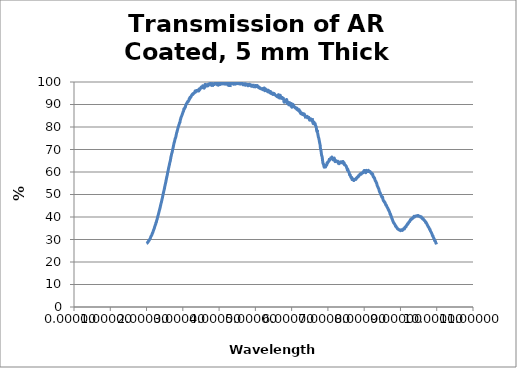
| Category | Series 0 |
|---|---|
| 2.00007 | 28.184 |
| 2.00994 | 28.275 |
| 2.0201 | 28.562 |
| 2.02997 | 28.654 |
| 2.03984 | 28.827 |
| 2.04998 | 29.098 |
| 2.05984 | 29.573 |
| 2.06999 | 29.534 |
| 2.07984 | 29.882 |
| 2.08997 | 30.163 |
| 2.09982 | 30.417 |
| 2.10995 | 30.806 |
| 2.11979 | 31.333 |
| 2.12991 | 31.591 |
| 2.14003 | 31.817 |
| 2.14986 | 32.211 |
| 2.15997 | 32.78 |
| 2.1698 | 32.995 |
| 2.1799 | 33.454 |
| 2.19 | 33.959 |
| 2.19982 | 34.438 |
| 2.20991 | 34.766 |
| 2.21972 | 35.372 |
| 2.22981 | 35.92 |
| 2.23989 | 36.397 |
| 2.24969 | 36.735 |
| 2.25977 | 37.517 |
| 2.26984 | 37.629 |
| 2.27991 | 38.534 |
| 2.2897 | 38.806 |
| 2.29976 | 39.561 |
| 2.30982 | 40.24 |
| 2.31987 | 40.815 |
| 2.32964 | 41.359 |
| 2.33969 | 42.04 |
| 2.34973 | 42.718 |
| 2.35977 | 43.308 |
| 2.36981 | 43.908 |
| 2.37984 | 44.627 |
| 2.38959 | 45.307 |
| 2.39962 | 46.044 |
| 2.40964 | 46.557 |
| 2.41965 | 47.316 |
| 2.42967 | 48.089 |
| 2.43968 | 48.739 |
| 2.44968 | 49.583 |
| 2.45968 | 50.369 |
| 2.46968 | 51.041 |
| 2.47968 | 51.724 |
| 2.48967 | 52.383 |
| 2.49965 | 53.287 |
| 2.50964 | 54.021 |
| 2.51961 | 54.75 |
| 2.52959 | 55.474 |
| 2.53956 | 56.311 |
| 2.54953 | 57.096 |
| 2.55949 | 57.906 |
| 2.56972 | 58.531 |
| 2.57968 | 59.552 |
| 2.58963 | 60.18 |
| 2.59957 | 60.951 |
| 2.60952 | 61.843 |
| 2.61945 | 62.463 |
| 2.62966 | 63.239 |
| 2.63959 | 64.041 |
| 2.64952 | 64.633 |
| 2.65944 | 65.383 |
| 2.66963 | 66.417 |
| 2.67954 | 67.113 |
| 2.68945 | 67.926 |
| 2.69963 | 68.457 |
| 2.70953 | 69.064 |
| 2.71943 | 69.942 |
| 2.72959 | 70.637 |
| 2.73948 | 71.329 |
| 2.74936 | 72.168 |
| 2.75951 | 72.971 |
| 2.76939 | 73.461 |
| 2.77953 | 74.144 |
| 2.78939 | 74.923 |
| 2.79953 | 75.15 |
| 2.80938 | 75.803 |
| 2.81951 | 76.553 |
| 2.82935 | 77.373 |
| 2.83947 | 77.862 |
| 2.84931 | 78.496 |
| 2.85941 | 79.101 |
| 2.86952 | 79.828 |
| 2.87934 | 80.164 |
| 2.88943 | 80.809 |
| 2.89925 | 81.256 |
| 2.90933 | 81.82 |
| 2.91941 | 81.983 |
| 2.92921 | 83.002 |
| 2.93927 | 83.488 |
| 2.94934 | 84.182 |
| 2.9594 | 84.569 |
| 2.96918 | 84.94 |
| 2.97923 | 85.323 |
| 2.98927 | 85.856 |
| 2.99931 | 86.339 |
| 3.00934 | 86.845 |
| 3.01937 | 87.019 |
| 3.02939 | 88.085 |
| 3.03914 | 88 |
| 3.04915 | 88.221 |
| 3.05916 | 88.759 |
| 3.06916 | 88.783 |
| 3.07916 | 89.631 |
| 3.08916 | 89.878 |
| 3.09914 | 90.389 |
| 3.10913 | 90.337 |
| 3.1191 | 90.811 |
| 3.12908 | 91.22 |
| 3.13931 | 91.403 |
| 3.14927 | 91.257 |
| 3.15923 | 91.693 |
| 3.16918 | 91.919 |
| 3.17913 | 92.669 |
| 3.18907 | 92.504 |
| 3.19927 | 93.198 |
| 3.2092 | 93.171 |
| 3.21912 | 93.197 |
| 3.22904 | 93.679 |
| 3.23922 | 93.907 |
| 3.24913 | 94.279 |
| 3.25904 | 94.461 |
| 3.2692 | 94.706 |
| 3.27909 | 94.467 |
| 3.28898 | 94.936 |
| 3.29913 | 94.872 |
| 3.309 | 95.133 |
| 3.31914 | 95.11 |
| 3.329 | 95.513 |
| 3.33912 | 96.084 |
| 3.34898 | 95.539 |
| 3.35909 | 95.681 |
| 3.36893 | 95.891 |
| 3.37903 | 96.218 |
| 3.38913 | 96.127 |
| 3.39895 | 96.287 |
| 3.40903 | 95.95 |
| 3.41911 | 96.261 |
| 3.42892 | 96.282 |
| 3.43898 | 96.018 |
| 3.44904 | 96.906 |
| 3.45883 | 96.406 |
| 3.46888 | 96.84 |
| 3.47892 | 96.853 |
| 3.48896 | 97.361 |
| 3.49899 | 97.352 |
| 3.50901 | 97.775 |
| 3.51903 | 97.606 |
| 3.52904 | 97.744 |
| 3.53878 | 97.62 |
| 3.54878 | 98.291 |
| 3.55877 | 97.497 |
| 3.56876 | 97.589 |
| 3.579 | 98.121 |
| 3.58897 | 97.263 |
| 3.59894 | 97.886 |
| 3.6089 | 98.711 |
| 3.61885 | 98.919 |
| 3.6288 | 98.048 |
| 3.63874 | 98.824 |
| 3.64894 | 98.636 |
| 3.65887 | 98.768 |
| 3.66879 | 98.595 |
| 3.6787 | 98.749 |
| 3.68887 | 98.229 |
| 3.69878 | 98.838 |
| 3.70867 | 99.115 |
| 3.71882 | 98.987 |
| 3.7287 | 98.692 |
| 3.73884 | 98.977 |
| 3.74871 | 98.987 |
| 3.75883 | 99.363 |
| 3.76869 | 98.135 |
| 3.7788 | 99.679 |
| 3.78864 | 98.398 |
| 3.79873 | 98.991 |
| 3.80882 | 99.238 |
| 3.81864 | 97.95 |
| 3.82872 | 98.904 |
| 3.83878 | 99.076 |
| 3.84859 | 99.253 |
| 3.85864 | 99.121 |
| 3.86868 | 98.855 |
| 3.87872 | 99.339 |
| 3.88875 | 99.207 |
| 3.89852 | 99.231 |
| 3.90854 | 99.593 |
| 3.91854 | 99.091 |
| 3.92855 | 99.449 |
| 3.93854 | 99.306 |
| 3.94853 | 98.747 |
| 3.95851 | 99.41 |
| 3.96848 | 98.861 |
| 3.9787 | 98.536 |
| 3.98866 | 98.95 |
| 3.99861 | 99.599 |
| 4.00856 | 99.605 |
| 4.01849 | 99.111 |
| 4.02867 | 98.888 |
| 4.0386 | 99.385 |
| 4.04851 | 99.28 |
| 4.05841 | 99.458 |
| 4.06857 | 99.099 |
| 4.07846 | 99.202 |
| 4.08859 | 99.373 |
| 4.09847 | 99.219 |
| 4.10859 | 99.809 |
| 4.11845 | 99.889 |
| 4.12855 | 99.186 |
| 4.1384 | 99.539 |
| 4.14849 | 99.893 |
| 4.15857 | 99.169 |
| 4.16839 | 99.044 |
| 4.17845 | 99.394 |
| 4.18851 | 99.099 |
| 4.19831 | 99.967 |
| 4.20835 | 99.269 |
| 4.21838 | 99.403 |
| 4.2284 | 99.854 |
| 4.23842 | 98.911 |
| 4.24842 | 98.627 |
| 4.25842 | 99.625 |
| 4.26841 | 99.339 |
| 4.2784 | 99.49 |
| 4.28837 | 99.394 |
| 4.29834 | 97.803 |
| 4.30829 | 99.071 |
| 4.31824 | 99.371 |
| 4.32843 | 98.748 |
| 4.33836 | 99.994 |
| 4.34829 | 99.531 |
| 4.3582 | 99.273 |
| 4.36836 | 99.558 |
| 4.37825 | 99.581 |
| 4.38839 | 99.821 |
| 4.39827 | 99.016 |
| 4.40839 | 99.399 |
| 4.41825 | 99.598 |
| 4.42835 | 99.518 |
| 4.4382 | 99.033 |
| 4.44828 | 99.263 |
| 4.45835 | 99.826 |
| 4.46817 | 99.231 |
| 4.47823 | 99.306 |
| 4.48828 | 99.249 |
| 4.49831 | 99.573 |
| 4.5081 | 99.767 |
| 4.51812 | 99.315 |
| 4.52813 | 99.369 |
| 4.53813 | 99.372 |
| 4.54812 | 99.194 |
| 4.5581 | 99.541 |
| 4.56807 | 99.679 |
| 4.57828 | 99.067 |
| 4.58823 | 99.284 |
| 4.59818 | 99.523 |
| 4.60811 | 99.237 |
| 4.61804 | 99.763 |
| 4.62819 | 99.343 |
| 4.6381 | 99.18 |
| 4.648 | 99.3 |
| 4.65812 | 98.76 |
| 4.668 | 98.899 |
| 4.67811 | 99.237 |
| 4.68797 | 99.103 |
| 4.69806 | 98.696 |
| 4.70813 | 98.971 |
| 4.71796 | 99.233 |
| 4.72802 | 98.535 |
| 4.73807 | 99.153 |
| 4.74811 | 98.837 |
| 4.75813 | 98.764 |
| 4.76791 | 99.019 |
| 4.77792 | 98.639 |
| 4.78792 | 98.881 |
| 4.79791 | 98.301 |
| 4.80788 | 98.525 |
| 4.81809 | 98.662 |
| 4.82804 | 98.942 |
| 4.83799 | 98.983 |
| 4.84792 | 98.476 |
| 4.85785 | 98.678 |
| 4.868 | 98.783 |
| 4.8779 | 98.308 |
| 4.88803 | 98.141 |
| 4.89791 | 98.442 |
| 4.90802 | 98.543 |
| 4.91788 | 98.107 |
| 4.92796 | 99.167 |
| 4.9378 | 98.335 |
| 4.94786 | 98.457 |
| 4.95792 | 97.906 |
| 4.96796 | 98.245 |
| 4.97799 | 98.126 |
| 4.98777 | 97.963 |
| 4.99778 | 97.859 |
| 5.00778 | 98.445 |
| 5.0176 | 98.053 |
| 5.02817 | 97.982 |
| 5.03799 | 97.985 |
| 5.0478 | 98.423 |
| 5.05762 | 98.254 |
| 5.06819 | 97.82 |
| 5.078 | 97.662 |
| 5.08781 | 97.946 |
| 5.09762 | 97.415 |
| 5.10743 | 97.6 |
| 5.11799 | 97.232 |
| 5.1278 | 97.432 |
| 5.13761 | 97.149 |
| 5.14741 | 97.015 |
| 5.15797 | 97.024 |
| 5.16777 | 96.996 |
| 5.17758 | 97.005 |
| 5.18738 | 97.049 |
| 5.19793 | 96.654 |
| 5.20773 | 96.643 |
| 5.21753 | 97.086 |
| 5.22732 | 96.746 |
| 5.23787 | 96.981 |
| 5.24767 | 97.339 |
| 5.25746 | 96.154 |
| 5.26801 | 96.551 |
| 5.2778 | 96.916 |
| 5.28759 | 96.346 |
| 5.29737 | 96.369 |
| 5.30792 | 96.521 |
| 5.3177 | 96.058 |
| 5.32749 | 96.061 |
| 5.33727 | 95.702 |
| 5.34781 | 95.744 |
| 5.35759 | 96.315 |
| 5.36737 | 96.045 |
| 5.3779 | 95.636 |
| 5.38768 | 95.361 |
| 5.39746 | 95.273 |
| 5.40724 | 95.183 |
| 5.41776 | 95.797 |
| 5.42754 | 95.258 |
| 5.43731 | 94.851 |
| 5.44783 | 94.976 |
| 5.4576 | 94.913 |
| 5.46737 | 94.753 |
| 5.47714 | 95.119 |
| 5.48766 | 94.445 |
| 5.49743 | 94.757 |
| 5.50719 | 94.656 |
| 5.51771 | 94.911 |
| 5.52747 | 94.611 |
| 5.53723 | 94.466 |
| 5.54774 | 94.265 |
| 5.5575 | 94.126 |
| 5.56726 | 93.866 |
| 5.57777 | 93.905 |
| 5.58752 | 93.684 |
| 5.59728 | 93.519 |
| 5.60778 | 93.752 |
| 5.61753 | 93.287 |
| 5.62728 | 93.996 |
| 5.63703 | 94.363 |
| 5.64753 | 93.78 |
| 5.65728 | 93.392 |
| 5.66702 | 92.855 |
| 5.67752 | 93.6 |
| 5.68726 | 94.08 |
| 5.69701 | 93.32 |
| 5.7075 | 93.301 |
| 5.71724 | 92.837 |
| 5.72698 | 93.687 |
| 5.73746 | 92.279 |
| 5.7472 | 93.234 |
| 5.75768 | 92.553 |
| 5.76742 | 93.159 |
| 5.77715 | 91.846 |
| 5.78763 | 91.379 |
| 5.79736 | 91.012 |
| 5.80709 | 91.827 |
| 5.81757 | 91.435 |
| 5.82729 | 91.655 |
| 5.83702 | 91.146 |
| 5.84749 | 91.908 |
| 5.85721 | 92.216 |
| 5.86693 | 92.016 |
| 5.8774 | 91.029 |
| 5.88712 | 90.248 |
| 5.89759 | 91.041 |
| 5.9073 | 90.412 |
| 5.91702 | 90.317 |
| 5.92748 | 91.379 |
| 5.93719 | 89.279 |
| 5.94691 | 90.274 |
| 5.95736 | 90.814 |
| 5.96707 | 89.47 |
| 5.97753 | 91.011 |
| 5.98723 | 88.807 |
| 5.99694 | 89.325 |
| 6.00739 | 88.793 |
| 6.01709 | 89.738 |
| 6.02679 | 89.886 |
| 6.03724 | 90.066 |
| 6.04694 | 89.533 |
| 6.05738 | 89.403 |
| 6.06708 | 89.216 |
| 6.07678 | 88.932 |
| 6.08722 | 88.687 |
| 6.09691 | 88.424 |
| 6.10734 | 88.664 |
| 6.11703 | 88.444 |
| 6.12672 | 88.457 |
| 6.13716 | 87.898 |
| 6.14684 | 88.347 |
| 6.15727 | 88.034 |
| 6.16696 | 87.548 |
| 6.17738 | 87.634 |
| 6.18706 | 87.457 |
| 6.19674 | 87.23 |
| 6.20717 | 87.724 |
| 6.21684 | 87.182 |
| 6.22726 | 86.522 |
| 6.23694 | 86.961 |
| 6.24661 | 86.087 |
| 6.25703 | 85.912 |
| 6.2667 | 85.89 |
| 6.27711 | 85.956 |
| 6.28678 | 86.153 |
| 6.29719 | 85.527 |
| 6.30685 | 85.956 |
| 6.31726 | 85.924 |
| 6.32692 | 85.797 |
| 6.33658 | 85.226 |
| 6.34698 | 85.79 |
| 6.35664 | 85.481 |
| 6.36704 | 85.081 |
| 6.3767 | 84.846 |
| 6.38709 | 83.84 |
| 6.39675 | 84.916 |
| 6.40714 | 84.111 |
| 6.41679 | 84.119 |
| 6.42718 | 84.741 |
| 6.43683 | 84.294 |
| 6.44647 | 84.337 |
| 6.45686 | 84.179 |
| 6.4665 | 84.278 |
| 6.47689 | 84.214 |
| 6.48653 | 83.477 |
| 6.49691 | 83.073 |
| 6.50655 | 84.193 |
| 6.51692 | 83.452 |
| 6.52656 | 83.384 |
| 6.53693 | 83.338 |
| 6.54657 | 83.075 |
| 6.55694 | 82.812 |
| 6.56657 | 83.882 |
| 6.57693 | 82.505 |
| 6.58656 | 81.911 |
| 6.59693 | 81.49 |
| 6.60655 | 82.167 |
| 6.61691 | 82.114 |
| 6.62653 | 81.418 |
| 6.63689 | 81.387 |
| 6.64651 | 81.525 |
| 6.65687 | 80.803 |
| 6.66648 | 80.33 |
| 6.67684 | 80.058 |
| 6.68645 | 78.876 |
| 6.6968 | 77.906 |
| 6.70641 | 78.711 |
| 6.71675 | 77.389 |
| 6.72636 | 76.485 |
| 6.7367 | 75.601 |
| 6.74631 | 75.104 |
| 6.75665 | 74.432 |
| 6.76625 | 73.445 |
| 6.77659 | 72.708 |
| 6.78692 | 71.737 |
| 6.79652 | 70.165 |
| 6.80685 | 69.765 |
| 6.81645 | 68.569 |
| 6.82678 | 67.347 |
| 6.83637 | 67.052 |
| 6.84669 | 66.061 |
| 6.85628 | 64.676 |
| 6.86661 | 63.713 |
| 6.87619 | 63.587 |
| 6.88651 | 62.802 |
| 6.89683 | 62.159 |
| 6.90641 | 62.452 |
| 6.91672 | 62.477 |
| 6.9263 | 62.581 |
| 6.93661 | 62.203 |
| 6.94619 | 63 |
| 6.9565 | 62.942 |
| 6.96681 | 63.112 |
| 6.97638 | 64.064 |
| 6.98668 | 63.86 |
| 6.99625 | 64.442 |
| 7.00655 | 64.342 |
| 7.01611 | 64.662 |
| 7.02641 | 64.858 |
| 7.03671 | 65.657 |
| 7.04626 | 64.861 |
| 7.05656 | 66.074 |
| 7.06611 | 66.172 |
| 7.0764 | 66.068 |
| 7.08669 | 66.088 |
| 7.09624 | 66.075 |
| 7.10653 | 66.646 |
| 7.11608 | 66.268 |
| 7.12636 | 65.822 |
| 7.13664 | 65.46 |
| 7.14618 | 65.391 |
| 7.15646 | 65.533 |
| 7.166 | 65.697 |
| 7.17627 | 66.18 |
| 7.18654 | 65.482 |
| 7.19608 | 64.609 |
| 7.20635 | 65.015 |
| 7.21661 | 65.073 |
| 7.22615 | 64.768 |
| 7.23641 | 64.823 |
| 7.24594 | 64.666 |
| 7.2562 | 64.662 |
| 7.26646 | 64.592 |
| 7.27598 | 64.754 |
| 7.28623 | 63.867 |
| 7.29649 | 64.378 |
| 7.30601 | 63.703 |
| 7.31626 | 64.03 |
| 7.3265 | 63.987 |
| 7.33602 | 64.035 |
| 7.34626 | 64.454 |
| 7.3565 | 64.33 |
| 7.36601 | 64.536 |
| 7.37625 | 64.168 |
| 7.38649 | 64.38 |
| 7.396 | 64.01 |
| 7.40623 | 64.354 |
| 7.41646 | 64.671 |
| 7.42596 | 63.821 |
| 7.43619 | 63.972 |
| 7.44642 | 64.108 |
| 7.45591 | 63.212 |
| 7.46614 | 63.286 |
| 7.47636 | 63.082 |
| 7.48585 | 62.998 |
| 7.49607 | 62.673 |
| 7.50628 | 62.509 |
| 7.51577 | 61.954 |
| 7.52598 | 61.706 |
| 7.53619 | 60.841 |
| 7.54568 | 61.255 |
| 7.55588 | 60.763 |
| 7.56609 | 60.362 |
| 7.57629 | 59.946 |
| 7.58577 | 59.726 |
| 7.59597 | 58.783 |
| 7.60617 | 58.735 |
| 7.61564 | 58.662 |
| 7.62583 | 57.959 |
| 7.63603 | 57.564 |
| 7.64622 | 57.618 |
| 7.65568 | 57.598 |
| 7.66587 | 56.655 |
| 7.67606 | 56.981 |
| 7.68624 | 56.578 |
| 7.6957 | 56.859 |
| 7.70588 | 56.367 |
| 7.71606 | 56.193 |
| 7.72623 | 56.669 |
| 7.73568 | 56.581 |
| 7.74586 | 56.707 |
| 7.75603 | 56.753 |
| 7.7662 | 57.043 |
| 7.77564 | 56.72 |
| 7.78581 | 57.301 |
| 7.79597 | 57.356 |
| 7.80614 | 57.649 |
| 7.81557 | 57.819 |
| 7.82573 | 57.785 |
| 7.83589 | 57.832 |
| 7.84604 | 58.392 |
| 7.85547 | 58.277 |
| 7.86562 | 58.482 |
| 7.87577 | 58.886 |
| 7.88592 | 58.834 |
| 7.89607 | 59.237 |
| 7.90549 | 59.288 |
| 7.91563 | 58.957 |
| 7.92577 | 59.282 |
| 7.93591 | 59.58 |
| 7.94605 | 59.574 |
| 7.95546 | 59.751 |
| 7.96559 | 59.604 |
| 7.97572 | 60.149 |
| 7.98585 | 60.097 |
| 7.99598 | 60.507 |
| 8.00538 | 60.679 |
| 8.01551 | 60.171 |
| 8.02563 | 60.173 |
| 8.03575 | 59.869 |
| 8.04587 | 59.727 |
| 8.05598 | 60.701 |
| 8.06538 | 60.388 |
| 8.07549 | 60.197 |
| 8.0856 | 60.287 |
| 8.09571 | 60.399 |
| 8.10582 | 60.433 |
| 8.11592 | 60.735 |
| 8.1253 | 60.225 |
| 8.1354 | 60.273 |
| 8.1455 | 60.211 |
| 8.1556 | 60.21 |
| 8.16569 | 60.16 |
| 8.17579 | 59.786 |
| 8.18588 | 59.668 |
| 8.19525 | 59.357 |
| 8.20534 | 59.519 |
| 8.21542 | 58.941 |
| 8.22551 | 59.074 |
| 8.23559 | 59.036 |
| 8.24567 | 58.084 |
| 8.25574 | 57.807 |
| 8.26582 | 57.745 |
| 8.27517 | 57.317 |
| 8.28525 | 57.304 |
| 8.29532 | 56.644 |
| 8.30538 | 56.162 |
| 8.31545 | 55.975 |
| 8.32552 | 55.701 |
| 8.33558 | 55.079 |
| 8.34564 | 55.027 |
| 8.3557 | 54.121 |
| 8.36575 | 53.703 |
| 8.37509 | 53.48 |
| 8.38514 | 52.973 |
| 8.39519 | 52.756 |
| 8.40524 | 52.29 |
| 8.41528 | 51.612 |
| 8.42533 | 51.089 |
| 8.43537 | 50.913 |
| 8.44541 | 50.481 |
| 8.45545 | 50.064 |
| 8.46549 | 49.68 |
| 8.47552 | 49.418 |
| 8.48555 | 48.879 |
| 8.49558 | 48.829 |
| 8.50561 | 48.9 |
| 8.51564 | 48.034 |
| 8.52566 | 47.413 |
| 8.53568 | 47.205 |
| 8.54499 | 47.109 |
| 8.555 | 46.667 |
| 8.56502 | 46.619 |
| 8.57503 | 46.33 |
| 8.58505 | 45.889 |
| 8.59506 | 45.36 |
| 8.60506 | 45.379 |
| 8.61507 | 45.056 |
| 8.62507 | 44.608 |
| 8.63508 | 44.305 |
| 8.64507 | 44.025 |
| 8.65507 | 43.84 |
| 8.66507 | 43.22 |
| 8.67506 | 43.121 |
| 8.68505 | 42.702 |
| 8.69504 | 42.359 |
| 8.70503 | 41.972 |
| 8.71501 | 41.224 |
| 8.725 | 41.276 |
| 8.73498 | 40.582 |
| 8.74496 | 40.373 |
| 8.75493 | 39.847 |
| 8.76491 | 39.257 |
| 8.77488 | 39.042 |
| 8.78485 | 38.516 |
| 8.79482 | 38.011 |
| 8.80479 | 37.806 |
| 8.81546 | 37.309 |
| 8.82542 | 37.147 |
| 8.83538 | 36.982 |
| 8.84534 | 36.562 |
| 8.8553 | 36.442 |
| 8.86525 | 35.898 |
| 8.8752 | 35.952 |
| 8.88515 | 35.543 |
| 8.8951 | 35.348 |
| 8.90504 | 35.168 |
| 8.91498 | 34.809 |
| 8.92493 | 34.838 |
| 8.93486 | 34.632 |
| 8.9448 | 34.486 |
| 8.95473 | 34.351 |
| 8.96538 | 34.265 |
| 8.97531 | 34.345 |
| 8.98523 | 34.079 |
| 8.99516 | 34.254 |
| 9.00508 | 33.931 |
| 9.015 | 34.056 |
| 9.02492 | 34.297 |
| 9.03484 | 34.274 |
| 9.04476 | 34.115 |
| 9.05467 | 34.03 |
| 9.06529 | 34.217 |
| 9.07519 | 34.429 |
| 9.0851 | 34.712 |
| 9.095 | 34.937 |
| 9.10491 | 34.838 |
| 9.11481 | 34.766 |
| 9.1247 | 35.477 |
| 9.1346 | 35.52 |
| 9.1452 | 35.746 |
| 9.15509 | 35.692 |
| 9.16498 | 36.102 |
| 9.17486 | 36.445 |
| 9.18475 | 36.505 |
| 9.19463 | 36.981 |
| 9.20451 | 36.862 |
| 9.21509 | 37.175 |
| 9.22497 | 37.447 |
| 9.23484 | 37.769 |
| 9.24471 | 37.964 |
| 9.25458 | 37.98 |
| 9.26515 | 38.5 |
| 9.27501 | 38.831 |
| 9.28487 | 38.69 |
| 9.29473 | 39.138 |
| 9.30459 | 39.11 |
| 9.31445 | 39.088 |
| 9.325 | 39.499 |
| 9.33485 | 39.401 |
| 9.3447 | 39.69 |
| 9.35455 | 39.665 |
| 9.36439 | 40.119 |
| 9.37494 | 40.311 |
| 9.38477 | 39.964 |
| 9.39461 | 40.083 |
| 9.40445 | 40.28 |
| 9.41498 | 40.395 |
| 9.42481 | 40.401 |
| 9.43464 | 40.473 |
| 9.44446 | 40.503 |
| 9.45499 | 40.552 |
| 9.46481 | 40.444 |
| 9.47463 | 40.569 |
| 9.48444 | 40.706 |
| 9.49496 | 40.435 |
| 9.50477 | 40.339 |
| 9.51458 | 40.399 |
| 9.52439 | 40.383 |
| 9.53489 | 40.239 |
| 9.54469 | 40.222 |
| 9.55449 | 39.94 |
| 9.56429 | 39.975 |
| 9.57479 | 40.104 |
| 9.58458 | 39.713 |
| 9.59437 | 39.459 |
| 9.60486 | 39.316 |
| 9.61464 | 39.055 |
| 9.62443 | 39.311 |
| 9.63421 | 38.899 |
| 9.64469 | 38.708 |
| 9.65446 | 38.6 |
| 9.66424 | 38.322 |
| 9.67471 | 38.273 |
| 9.68448 | 37.977 |
| 9.69424 | 37.523 |
| 9.70471 | 37.64 |
| 9.71447 | 37.312 |
| 9.72423 | 37.14 |
| 9.73468 | 36.557 |
| 9.74444 | 36.417 |
| 9.75419 | 36.102 |
| 9.76464 | 35.656 |
| 9.77439 | 35.548 |
| 9.78413 | 35.282 |
| 9.79457 | 34.9 |
| 9.80431 | 34.462 |
| 9.81475 | 34.477 |
| 9.82448 | 33.887 |
| 9.83422 | 33.585 |
| 9.84464 | 33.264 |
| 9.85437 | 33.042 |
| 9.8641 | 32.615 |
| 9.87452 | 32.181 |
| 9.88424 | 31.658 |
| 9.89465 | 31.659 |
| 9.90437 | 31.019 |
| 9.91408 | 30.783 |
| 9.92449 | 30.409 |
| 9.9342 | 30.043 |
| 9.9446 | 29.432 |
| 9.9543 | 29.382 |
| 9.96401 | 29.18 |
| 9.9744 | 28.587 |
| 9.9841 | 28.315 |
| 9.99448 | 27.846 |